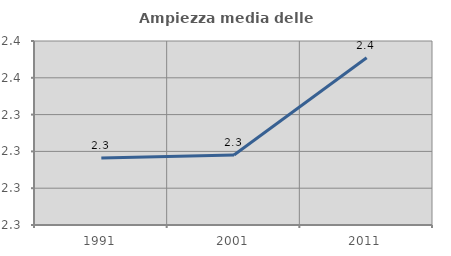
| Category | Ampiezza media delle famiglie |
|---|---|
| 1991.0 | 2.316 |
| 2001.0 | 2.318 |
| 2011.0 | 2.371 |